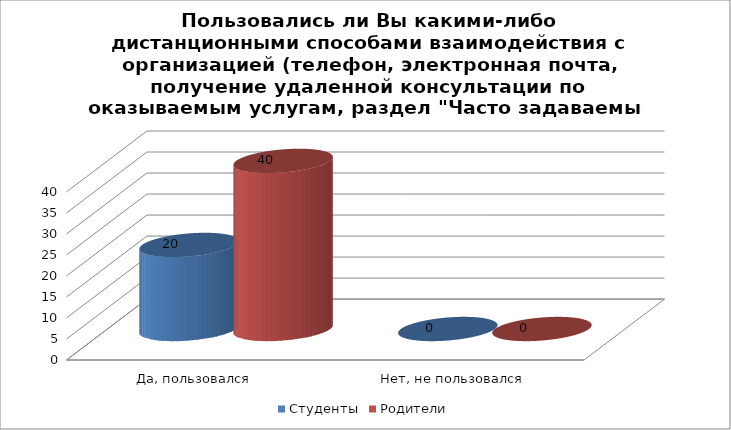
| Category | Студенты | Родители |
|---|---|---|
| Да, пользовался | 20 | 40 |
| Нет, не пользовался | 0 | 0 |